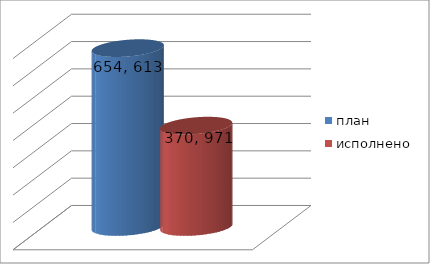
| Category | план | исполнено |
|---|---|---|
| 0 | 654613389.6 | 370971951.23 |